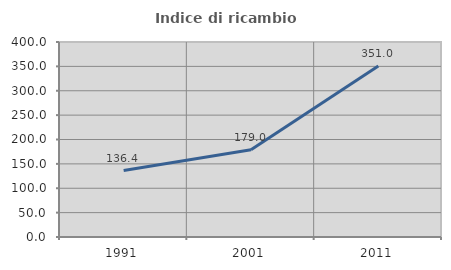
| Category | Indice di ricambio occupazionale  |
|---|---|
| 1991.0 | 136.406 |
| 2001.0 | 178.98 |
| 2011.0 | 351.006 |